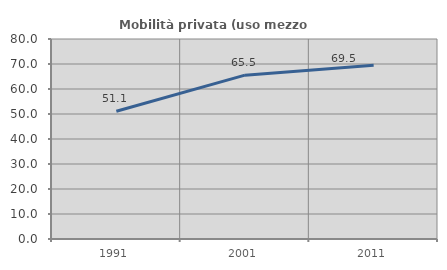
| Category | Mobilità privata (uso mezzo privato) |
|---|---|
| 1991.0 | 51.077 |
| 2001.0 | 65.548 |
| 2011.0 | 69.537 |